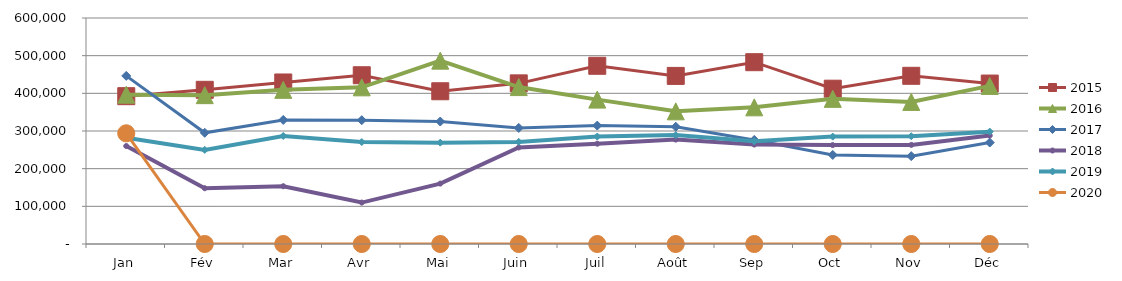
| Category | 2015 | 2016 | 2017 | 2018 | 2019 | 2020 |
|---|---|---|---|---|---|---|
| Jan | 392455.386 | 396263.914 | 446281.806 | 260114.073 | 282172.738 | 293841.353 |
| Fév | 409347.179 | 395175.975 | 295222.519 | 148036.843 | 249871.665 | 0 |
| Mar | 428838.698 | 409222.091 | 329338.872 | 153395.928 | 286777.302 | 0 |
| Avr | 448014.817 | 415901.642 | 328702.589 | 109982.902 | 270782.686 | 0 |
| Mai | 405528.286 | 486763.336 | 325158.457 | 160382.707 | 269027.301 | 0 |
| Juin | 426462.87 | 416602.613 | 308100.463 | 256426.409 | 271108.83 | 0 |
| Juil | 473107.942 | 383313.72 | 314407.38 | 266269.669 | 285234.508 | 0 |
| Août | 446267.927 | 352198.565 | 311304.785 | 277231.878 | 289072.19 | 0 |
| Sep | 482677.503 | 362763.978 | 276260.727 | 263963.731 | 272549.159 | 0 |
| Oct | 412311.701 | 385353.331 | 236379.756 | 262549.621 | 285123.451 | 0 |
| Nov | 446526.169 | 377201.543 | 233251.128 | 263155.863 | 286119.242 | 0 |
| Déc | 425963.85 | 419714.854 | 269424.356 | 287963.859 | 298314.346 | 0 |